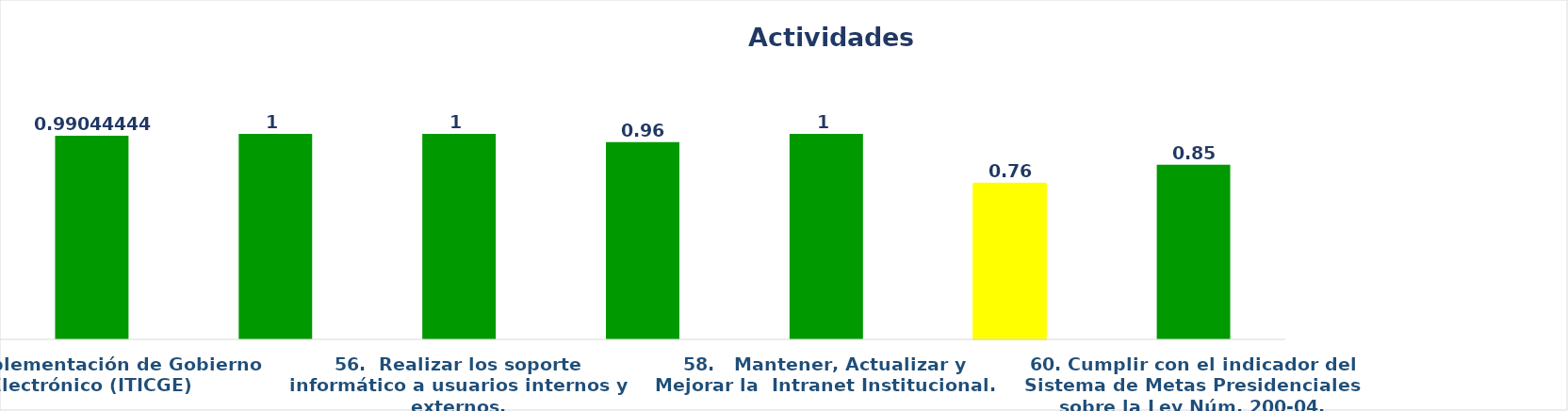
| Category | Series 0 |
|---|---|
| 54.  Implementación de Gobierno Electrónico (ITICGE) | 0.99 |
| 55.  Realizar Mantenimiento y Mejora del Sistema de Información Catastral (SIC). | 1 |
| 56.  Realizar los soporte informático a usuarios internos y externos. | 1 |
| 57.  Mantener, actualizar y mejorar la página Web de la DGCN.   | 0.96 |
| 58.   Mantener, Actualizar y Mejorar la  Intranet Institucional. | 1 |
| 59.  Implementar el Plan de Gestión de Riesgos. | 0.76 |
| 60. Cumplir con el indicador del Sistema de Metas Presidenciales sobre la Ley Núm. 200-04. | 0.85 |